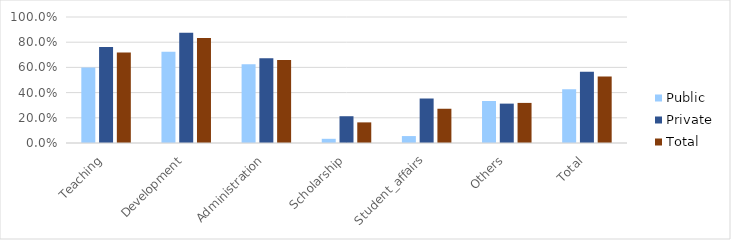
| Category | Public | Private | Total |
|---|---|---|---|
| Teaching | 0.6 | 0.763 | 0.718 |
| Development | 0.723 | 0.876 | 0.834 |
| Administration | 0.625 | 0.672 | 0.659 |
| Scholarship | 0.033 | 0.212 | 0.164 |
| Student_affairs | 0.055 | 0.353 | 0.272 |
| Others | 0.333 | 0.312 | 0.318 |
| Total | 0.427 | 0.565 | 0.527 |